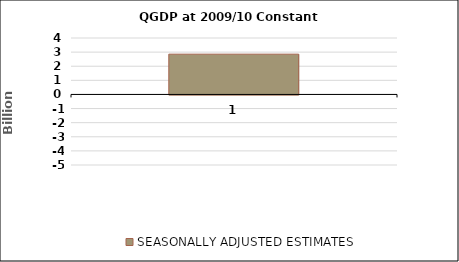
| Category | SEASONALLY ADJUSTED ESTIMATES |
|---|---|
| 0 | 2.854 |